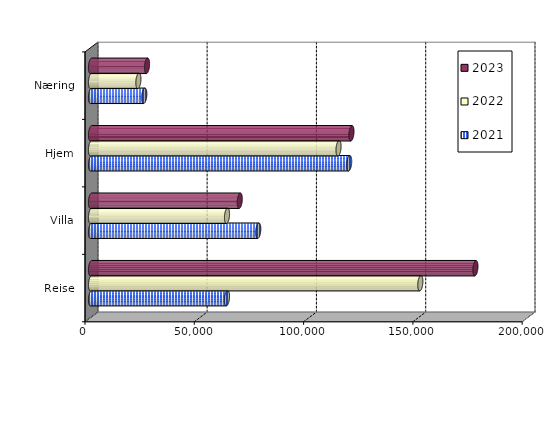
| Category | 2021 | 2022 | 2023 |
|---|---|---|---|
| Reise | 62196 | 150658 | 175866.413 |
| Villa | 76519.525 | 62223.451 | 68045.34 |
| Hjem | 118109 | 113246.487 | 119152.605 |
| Næring | 24373.17 | 21677.887 | 25631.026 |